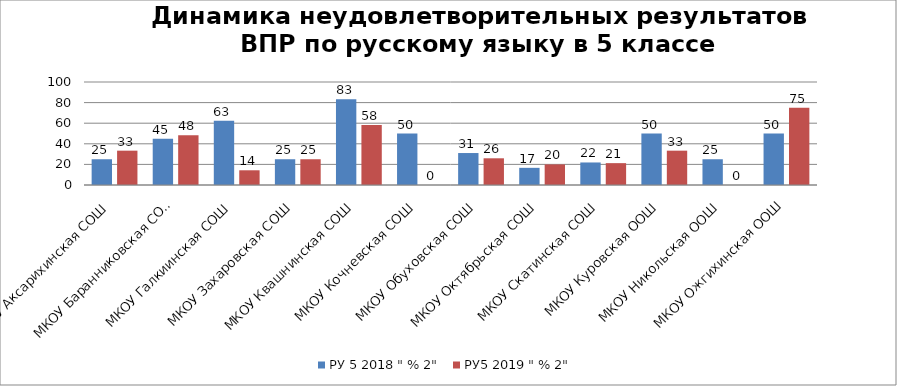
| Category | РУ 5 2018 " % 2" | РУ5 2019 " % 2" |
|---|---|---|
| МКОУ Аксарихинская СОШ | 25 | 33.333 |
| МКОУ Баранниковская СОШ | 45 | 48.276 |
| МКОУ Галкиинская СОШ | 62.5 | 14.286 |
| МКОУ Захаровская СОШ | 25 | 25 |
| МКОУ Квашнинская СОШ | 83.333 | 58.333 |
| МКОУ Кочневская СОШ | 50 | 0 |
| МКОУ Обуховская СОШ | 31.034 | 25.926 |
| МКОУ Октябрьская СОШ | 16.667 | 20 |
| МКОУ Скатинская СОШ | 21.875 | 21.212 |
| МКОУ Куровская ООШ | 50 | 33.333 |
| МКОУ Никольская ООШ | 25 | 0 |
| МКОУ Ожгихинская ООШ | 50 | 75 |